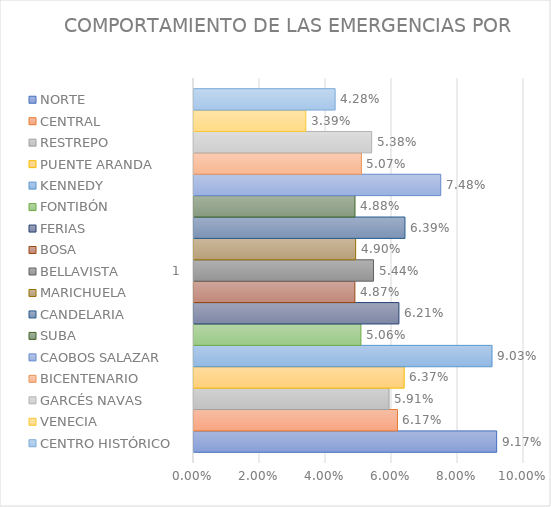
| Category | NORTE | CENTRAL | RESTREPO | PUENTE ARANDA | KENNEDY | FONTIBÓN | FERIAS | BOSA | BELLAVISTA | MARICHUELA | CANDELARIA | SUBA | CAOBOS SALAZAR | BICENTENARIO | GARCÉS NAVAS | VENECIA | CENTRO HISTÓRICO |
|---|---|---|---|---|---|---|---|---|---|---|---|---|---|---|---|---|---|
| 0 | 0.092 | 0.062 | 0.059 | 0.064 | 0.09 | 0.051 | 0.062 | 0.049 | 0.054 | 0.049 | 0.064 | 0.049 | 0.075 | 0.051 | 0.054 | 0.034 | 0.043 |